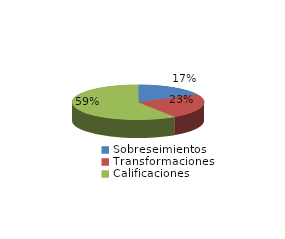
| Category | Series 0 |
|---|---|
| Sobreseimientos | 1366 |
| Transformaciones | 1818 |
| Calificaciones | 4625 |